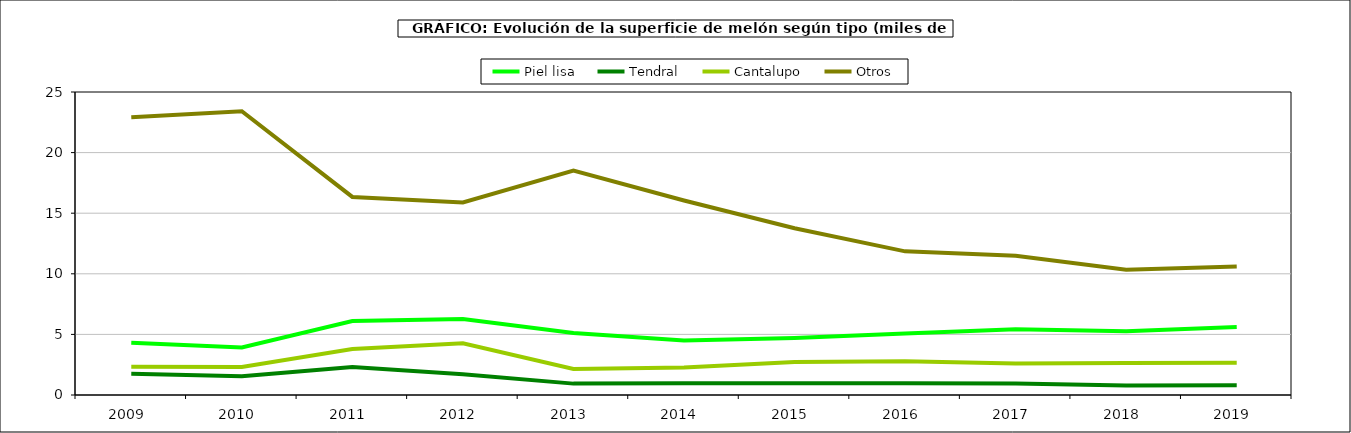
| Category | Piel lisa | Tendral | Cantalupo | Otros |
|---|---|---|---|---|
| 2009.0 | 4.319 | 1.755 | 2.33 | 22.923 |
| 2010.0 | 3.925 | 1.546 | 2.308 | 23.409 |
| 2011.0 | 6.109 | 2.318 | 3.791 | 16.343 |
| 2012.0 | 6.265 | 1.708 | 4.27 | 15.887 |
| 2013.0 | 5.109 | 0.939 | 2.152 | 18.523 |
| 2014.0 | 4.503 | 0.973 | 2.277 | 16.047 |
| 2015.0 | 4.698 | 0.96 | 2.723 | 13.763 |
| 2016.0 | 5.074 | 0.966 | 2.793 | 11.853 |
| 2017.0 | 5.417 | 0.953 | 2.608 | 11.495 |
| 2018.0 | 5.27 | 0.78 | 2.648 | 10.327 |
| 2019.0 | 5.608 | 0.803 | 2.669 | 10.611 |